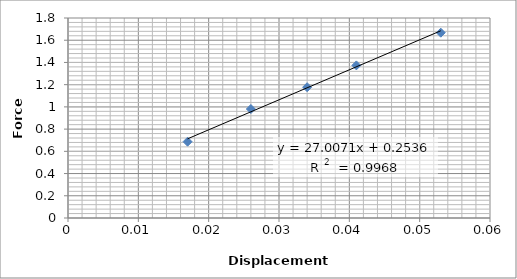
| Category | Force (N) |
|---|---|
| 0.017 | 0.687 |
| 0.026 | 0.981 |
| 0.034 | 1.177 |
| 0.041 | 1.373 |
| 0.053 | 1.668 |